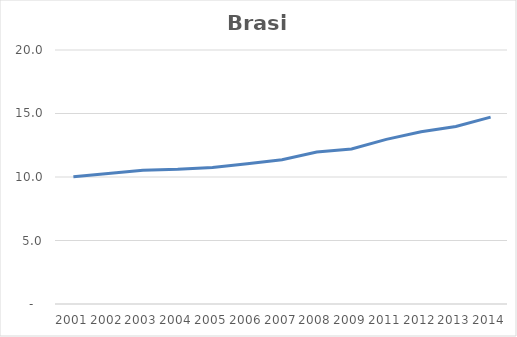
| Category | Total |
|---|---|
| 2001.0 | 10.017 |
| 2002.0 | 10.272 |
| 2003.0 | 10.539 |
| 2004.0 | 10.605 |
| 2005.0 | 10.75 |
| 2006.0 | 11.05 |
| 2007.0 | 11.362 |
| 2008.0 | 11.96 |
| 2009.0 | 12.212 |
| 2011.0 | 12.962 |
| 2012.0 | 13.569 |
| 2013.0 | 13.982 |
| 2014.0 | 14.712 |